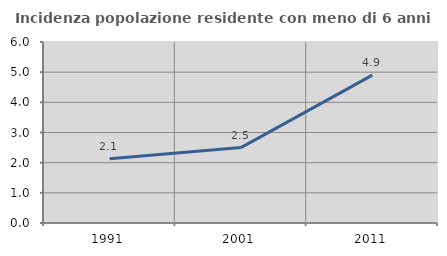
| Category | Incidenza popolazione residente con meno di 6 anni |
|---|---|
| 1991.0 | 2.128 |
| 2001.0 | 2.5 |
| 2011.0 | 4.902 |